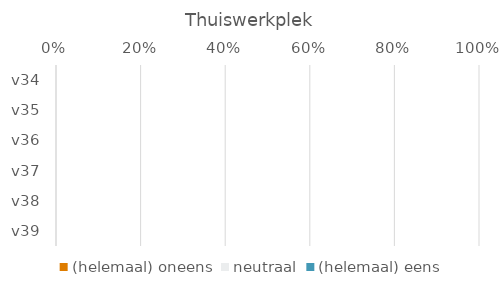
| Category | (helemaal) oneens | neutraal | (helemaal) eens |
|---|---|---|---|
| v34 | 0 | 0 | 0 |
| v35 | 0 | 0 | 0 |
| v36 | 0 | 0 | 0 |
| v37 | 0 | 0 | 0 |
| v38 | 0 | 0 | 0 |
| v39 | 0 | 0 | 0 |